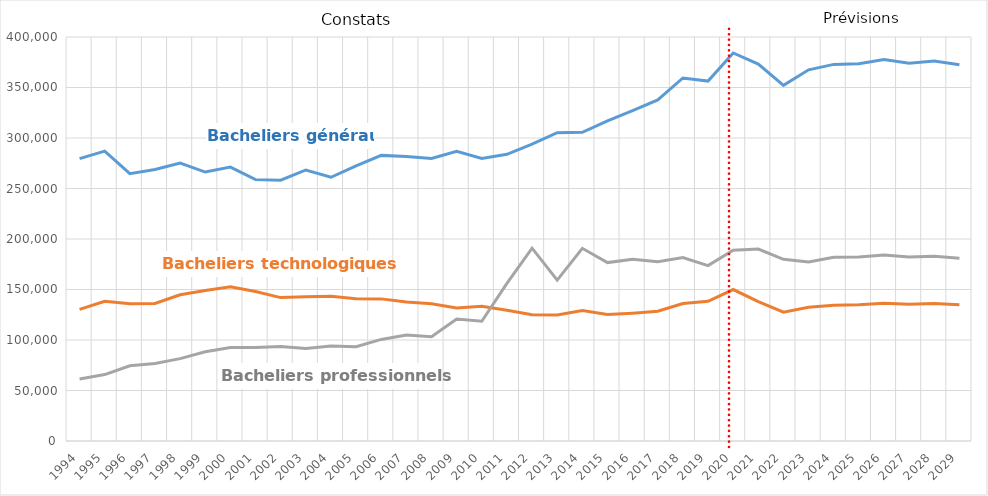
| Category | Bacheliers généraux | Bacheliers technologiques | Bacheliers professionnels |
|---|---|---|---|
| 1994.0 | 279586 | 130282 | 61465 |
| 1995.0 | 287046 | 138267 | 65741 |
| 1996.0 | 264727 | 135882 | 74514 |
| 1997.0 | 268868 | 136204 | 76726 |
| 1998.0 | 275113 | 144830 | 81573 |
| 1999.0 | 266285 | 149103 | 88296 |
| 2000.0 | 271155 | 152778 | 92617 |
| 2001.0 | 258785 | 147944 | 92499 |
| 2002.0 | 258192 | 141983 | 93580 |
| 2003.0 | 268335 | 142799 | 91537 |
| 2004.0 | 261137 | 143277 | 93958 |
| 2005.0 | 272512 | 140828 | 93268 |
| 2006.0 | 282788 | 140707 | 100562 |
| 2007.0 | 281733 | 137605 | 104975 |
| 2008.0 | 279698 | 135886 | 103311 |
| 2009.0 | 286762 | 131602 | 120728 |
| 2010.0 | 279798 | 133431 | 118593 |
| 2011.0 | 283821 | 129472 | 156063 |
| 2012.0 | 293837 | 125121 | 190899 |
| 2013.0 | 305316 | 124683 | 159225 |
| 2014.0 | 305667 | 129210 | 190773 |
| 2015.0 | 317054 | 125144 | 176646 |
| 2016.0 | 327078 | 126578 | 179841 |
| 2017.0 | 337714 | 128488 | 177570 |
| 2018.0 | 359455 | 136182 | 181650 |
| 2019.0 | 356380.307 | 138279.938 | 173672.789 |
| 2020.0 | 384158 | 149972 | 188841 |
| 2021.0 | 373187.046 | 137973.654 | 190052.819 |
| 2022.0 | 352172.424 | 127524.888 | 179912.995 |
| 2023.0 | 367507.855 | 132461.278 | 177176.672 |
| 2024.0 | 372872.37 | 134457.039 | 181984.532 |
| 2025.0 | 373520.862 | 134842.235 | 182239.656 |
| 2026.0 | 377612.183 | 136454.698 | 184031.249 |
| 2027.0 | 374015.555 | 135302.447 | 182278.658 |
| 2028.0 | 376163.82 | 136129.082 | 182842.691 |
| 2029.0 | 372574.431 | 134975.271 | 180994.066 |